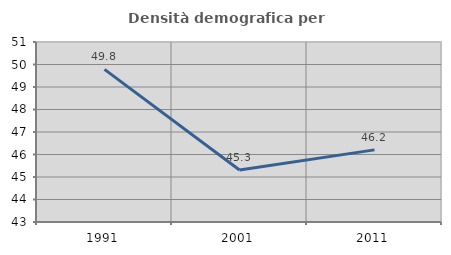
| Category | Densità demografica |
|---|---|
| 1991.0 | 49.781 |
| 2001.0 | 45.312 |
| 2011.0 | 46.206 |